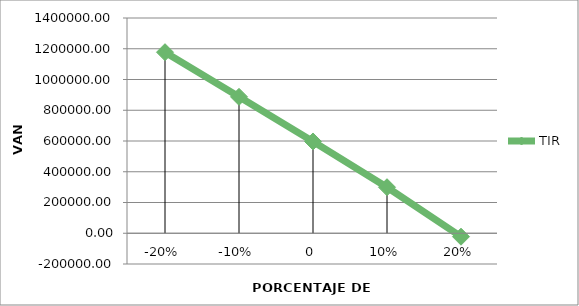
| Category | TIR |
|---|---|
| -0.2 | 1177480.15 |
| -0.1 | 887197.88 |
| 0.0 | 596915.48 |
| 0.1 | 299209.04 |
| 0.2 | -22509.7 |